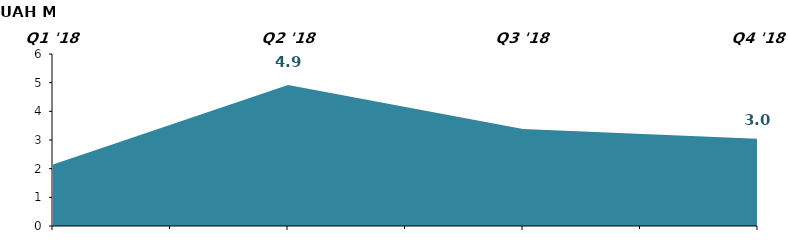
| Category | Accumulated Flow, YTD |
|---|---|
| Q1 '18 | 2.145 |
| Q2 '18 | 4.915 |
| Q3 '18 | 3.384 |
| Q4 '18 | 3.042 |